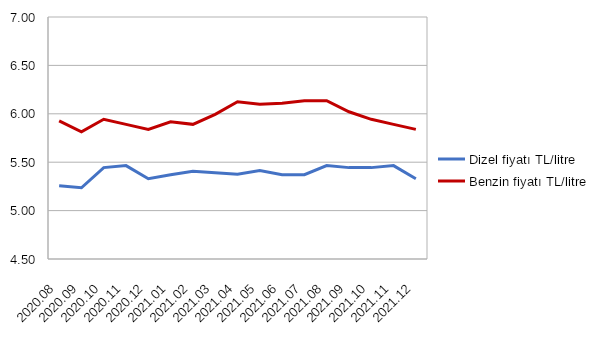
| Category | Dizel fiyatı | Benzin fiyatı |
|---|---|---|
| 2020-08-05 | 5.257 | 5.927 |
| 2020-09-05 | 5.236 | 5.813 |
| 2020-10-06 | 5.444 | 5.943 |
| 2020-11-06 | 5.465 | 5.891 |
| 2020-12-07 | 5.33 | 5.839 |
| 2021-01-07 | 5.371 | 5.917 |
| 2021-02-07 | 5.408 | 5.891 |
| 2021-03-10 | 5.392 | 5.995 |
| 2021-04-10 | 5.376 | 6.125 |
| 2021-05-11 | 5.413 | 6.099 |
| 2021-06-11 | 5.371 | 6.109 |
| 2021-07-12 | 5.371 | 6.135 |
| 2021-08-12 | 5.465 | 6.135 |
| 2021-09-12 | 5.444 | 6.021 |
| 2021-10-13 | 5.444 | 5.943 |
| 2021-11-13 | 5.465 | 5.891 |
| 2021-12-14 | 5.33 | 5.839 |